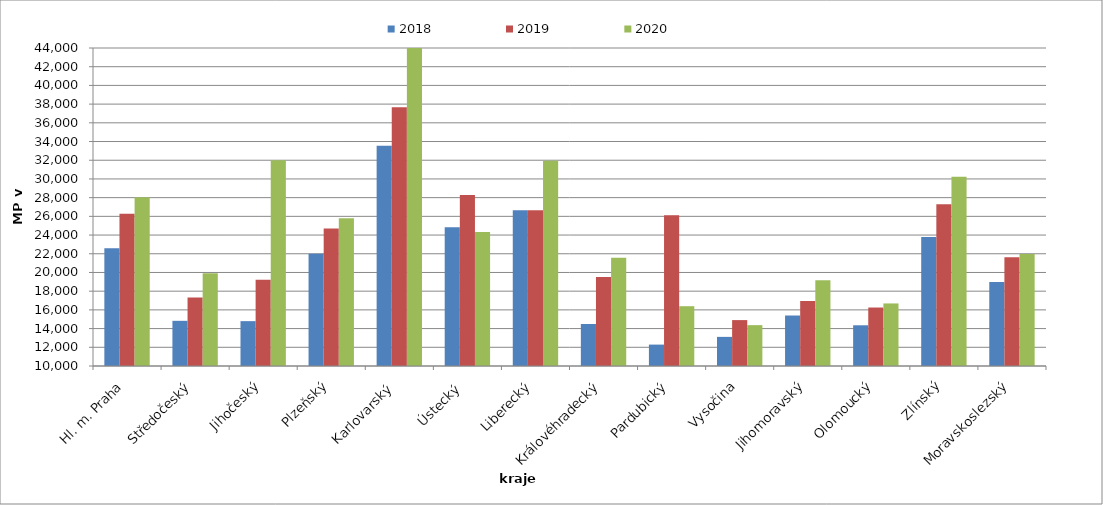
| Category | 2018 | 2019 | 2020 |
|---|---|---|---|
| Hl. m. Praha | 22592.844 | 26273.143 | 28036.17 |
| Středočeský | 14829.889 | 17336.094 | 19922.914 |
| Jihočeský | 14796.181 | 19223.811 | 32007.133 |
| Plzeňský | 21999.432 | 24704.93 | 25798.134 |
| Karlovarský  | 33547.126 | 37673.563 | 44180 |
| Ústecký   | 24842.496 | 28273.457 | 24325.499 |
| Liberecký | 26661.54 | 26661.54 | 31940.472 |
| Královéhradecký | 14493.783 | 19509.093 | 21561.976 |
| Pardubický | 12288.801 | 26127.025 | 16393.683 |
| Vysočina | 13113.695 | 14907.804 | 14367.923 |
| Jihomoravský | 15398.708 | 16961.506 | 19163.786 |
| Olomoucký | 14353.395 | 16251.562 | 16688.729 |
| Zlínský | 23794.914 | 27299.479 | 30246.178 |
| Moravskoslezský | 18991.575 | 21632.216 | 21971.968 |